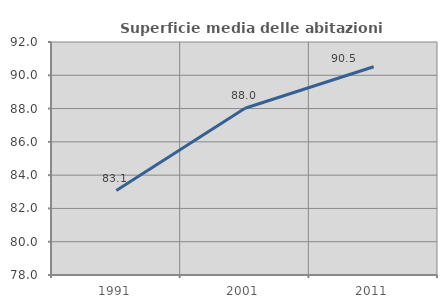
| Category | Superficie media delle abitazioni occupate |
|---|---|
| 1991.0 | 83.077 |
| 2001.0 | 88.018 |
| 2011.0 | 90.513 |